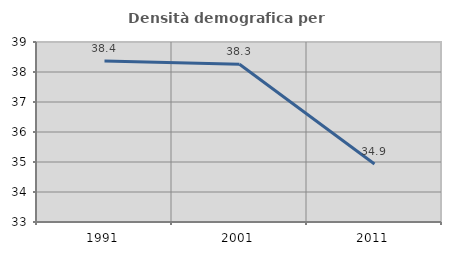
| Category | Densità demografica |
|---|---|
| 1991.0 | 38.363 |
| 2001.0 | 38.256 |
| 2011.0 | 34.934 |